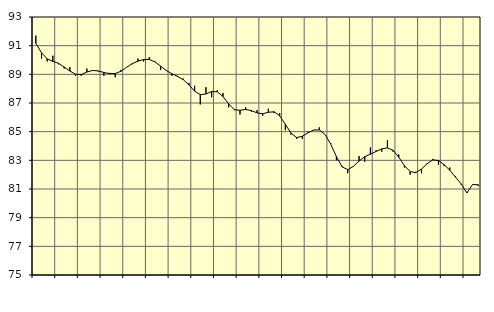
| Category | Piggar | Series 1 |
|---|---|---|
| nan | 91.7 | 91.17 |
| 1.0 | 90.1 | 90.51 |
| 1.0 | 89.9 | 90.08 |
| 1.0 | 90.3 | 89.9 |
| nan | 89.7 | 89.77 |
| 2.0 | 89.4 | 89.51 |
| 2.0 | 89.5 | 89.23 |
| 2.0 | 88.9 | 89.01 |
| nan | 88.9 | 88.98 |
| 3.0 | 89.4 | 89.16 |
| 3.0 | 89.3 | 89.27 |
| 3.0 | 89.2 | 89.24 |
| nan | 88.9 | 89.13 |
| 4.0 | 89.1 | 89.05 |
| 4.0 | 88.8 | 89.06 |
| 4.0 | 89.3 | 89.21 |
| nan | 89.5 | 89.49 |
| 5.0 | 89.7 | 89.75 |
| 5.0 | 90.1 | 89.92 |
| 5.0 | 89.9 | 90.03 |
| nan | 90.2 | 90.04 |
| 6.0 | 89.9 | 89.87 |
| 6.0 | 89.3 | 89.57 |
| 6.0 | 89.3 | 89.27 |
| nan | 88.9 | 89.04 |
| 7.0 | 88.9 | 88.85 |
| 7.0 | 88.7 | 88.63 |
| 7.0 | 88.4 | 88.26 |
| nan | 88.2 | 87.83 |
| 8.0 | 86.9 | 87.58 |
| 8.0 | 88.1 | 87.63 |
| 8.0 | 87.4 | 87.8 |
| nan | 87.9 | 87.78 |
| 9.0 | 87.7 | 87.45 |
| 9.0 | 86.7 | 86.94 |
| 9.0 | 86.5 | 86.54 |
| nan | 86.2 | 86.49 |
| 10.0 | 86.7 | 86.55 |
| 10.0 | 86.4 | 86.47 |
| 10.0 | 86.5 | 86.31 |
| nan | 86.1 | 86.25 |
| 11.0 | 86.6 | 86.35 |
| 11.0 | 86.3 | 86.39 |
| 11.0 | 86.3 | 86.11 |
| nan | 85.1 | 85.51 |
| 12.0 | 84.8 | 84.9 |
| 12.0 | 84.5 | 84.59 |
| 12.0 | 84.5 | 84.68 |
| nan | 85 | 84.92 |
| 13.0 | 85.1 | 85.12 |
| 13.0 | 85.3 | 85.12 |
| 13.0 | 84.8 | 84.8 |
| nan | 84.2 | 84.13 |
| 14.0 | 83 | 83.26 |
| 14.0 | 82.6 | 82.55 |
| 14.0 | 82.1 | 82.35 |
| nan | 82.6 | 82.58 |
| 15.0 | 83.3 | 82.95 |
| 15.0 | 82.9 | 83.26 |
| 15.0 | 83.9 | 83.43 |
| nan | 83.7 | 83.62 |
| 16.0 | 83.6 | 83.8 |
| 16.0 | 84.4 | 83.87 |
| 16.0 | 83.6 | 83.7 |
| nan | 83.4 | 83.22 |
| 17.0 | 82.5 | 82.63 |
| 17.0 | 82 | 82.22 |
| 17.0 | 82.2 | 82.14 |
| nan | 82.1 | 82.39 |
| 18.0 | 82.8 | 82.76 |
| 18.0 | 83.1 | 83.03 |
| 18.0 | 82.7 | 82.99 |
| nan | 82.6 | 82.7 |
| 19.0 | 82.5 | 82.31 |
| 19.0 | 81.9 | 81.83 |
| 19.0 | 81.3 | 81.36 |
| nan | 80.8 | 80.72 |
| 20.0 | 81.3 | 81.31 |
| 20.0 | 81.2 | 81.3 |